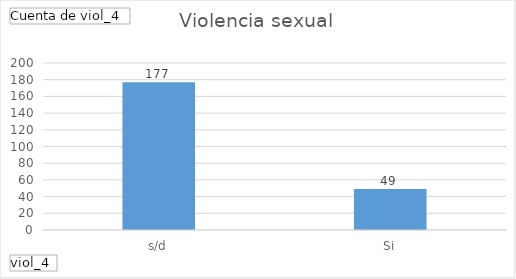
| Category | Total |
|---|---|
| s/d | 177 |
| Si | 49 |